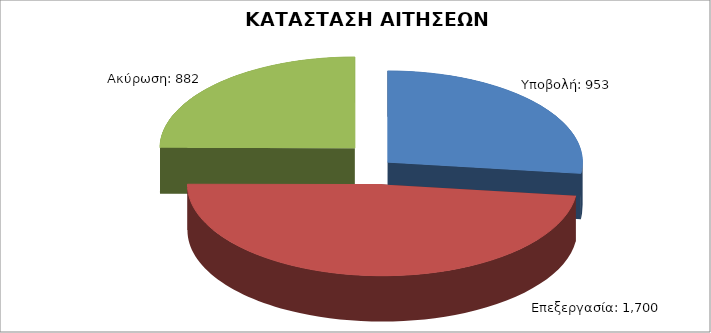
| Category | Series 0 |
|---|---|
| Υποβολή: | 953 |
| Επεξεργασία: | 1700 |
| Ακύρωση: | 882 |